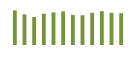
| Category | Saldo [ (1)-(2) ] |
|---|---|
| 0 | 329612.931 |
| 1 | 291358.085 |
| 2 | 266512.131 |
| 3 | 297562.723 |
| 4 | 310243.352 |
| 5 | 320714.531 |
| 6 | 286229.119 |
| 7 | 282809.198 |
| 8 | 306315.684 |
| 9 | 322195.815 |
| 10 | 306185.726 |
| 11 | 302506.637 |